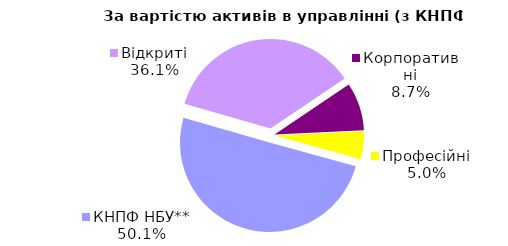
| Category | Series 0 |
|---|---|
| Відкриті | 916.276 |
| Корпоративні | 220.477 |
| Професійні | 127.85 |
| КНПФ НБУ** | 1272.096 |